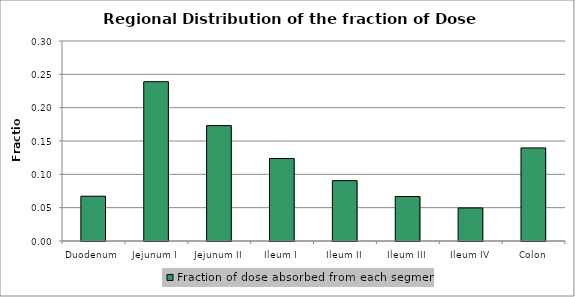
| Category | Fraction of dose absorbed from each segment |
|---|---|
| Duodenum | 0.067 |
| Jejunum I | 0.239 |
| Jejunum II | 0.173 |
| Ileum I | 0.124 |
| Ileum II | 0.091 |
| Ileum III | 0.067 |
| Ileum IV | 0.05 |
| Colon | 0.14 |